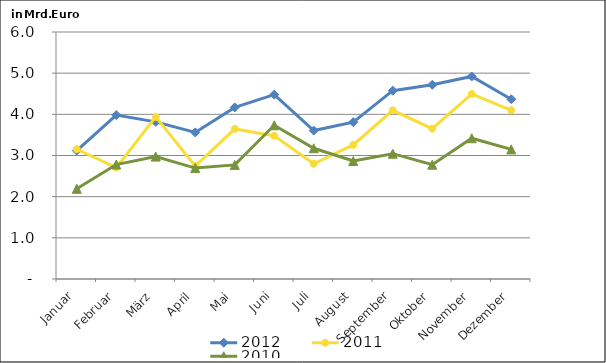
| Category | 2012 | 2011 | 2010 |
|---|---|---|---|
| Januar | 3.121 | 3.152 | 2.192 |
| Februar | 3.983 | 2.707 | 2.78 |
| März | 3.817 | 3.938 | 2.974 |
| April | 3.561 | 2.743 | 2.694 |
| Mai | 4.168 | 3.646 | 2.772 |
| Juni | 4.478 | 3.478 | 3.734 |
| Juli | 3.606 | 2.798 | 3.176 |
| August | 3.811 | 3.257 | 2.865 |
| September | 4.574 | 4.096 | 3.044 |
| Oktober | 4.718 | 3.651 | 2.777 |
| November | 4.92 | 4.495 | 3.419 |
| Dezember | 4.366 | 4.098 | 3.148 |